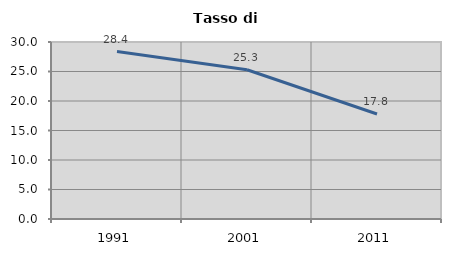
| Category | Tasso di disoccupazione   |
|---|---|
| 1991.0 | 28.388 |
| 2001.0 | 25.301 |
| 2011.0 | 17.794 |